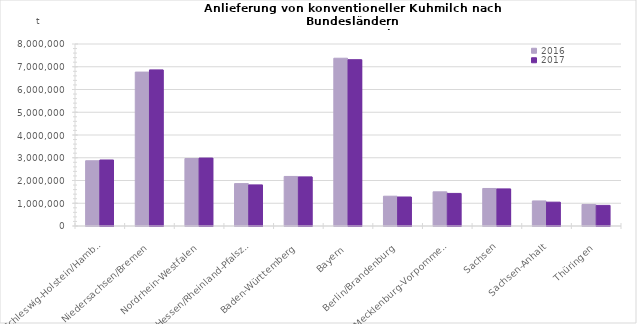
| Category | 2016 | 2017 |
|---|---|---|
| Schleswig-Holstein/Hamburg | 2868020.309 | 2901210.757 |
| Niedersachsen/Bremen | 6765250.302 | 6861998.753 |
| Nordrhein-Westfalen | 2965289.129 | 2986472.624 |
| Hessen/Rheinland-PfalszSaarland | 1863376.782 | 1806297.246 |
| Baden-Württemberg | 2177942.906 | 2158311.763 |
| Bayern | 7374412.754 | 7309765.262 |
| Berlin/Brandenburg | 1309476.644 | 1275199.785 |
| Mecklenburg-Vorpommern | 1501805.74 | 1432155.277 |
| Sachsen | 1649531.107 | 1630145.215 |
| Sachsen-Anhalt | 1100993.331 | 1047772.442 |
| Thüringen | 947151.933 | 906715.931 |